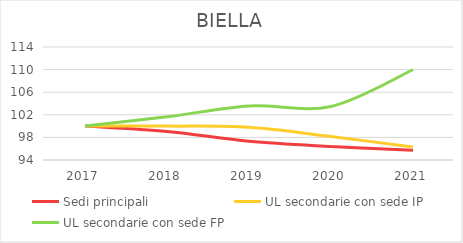
| Category | Sedi principali | UL secondarie con sede IP | UL secondarie con sede FP |
|---|---|---|---|
| 2017.0 | 100 | 100 | 100 |
| 2018.0 | 99.055 | 100 | 101.647 |
| 2019.0 | 97.321 | 99.786 | 103.568 |
| 2020.0 | 96.397 | 98.147 | 103.477 |
| 2021.0 | 95.723 | 96.294 | 109.973 |